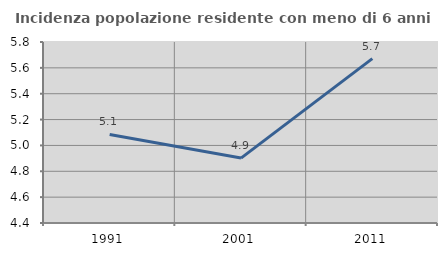
| Category | Incidenza popolazione residente con meno di 6 anni |
|---|---|
| 1991.0 | 5.085 |
| 2001.0 | 4.902 |
| 2011.0 | 5.671 |